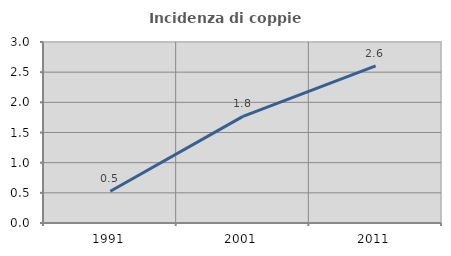
| Category | Incidenza di coppie miste |
|---|---|
| 1991.0 | 0.526 |
| 2001.0 | 1.768 |
| 2011.0 | 2.604 |